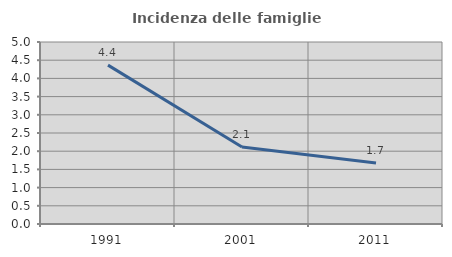
| Category | Incidenza delle famiglie numerose |
|---|---|
| 1991.0 | 4.365 |
| 2001.0 | 2.116 |
| 2011.0 | 1.675 |